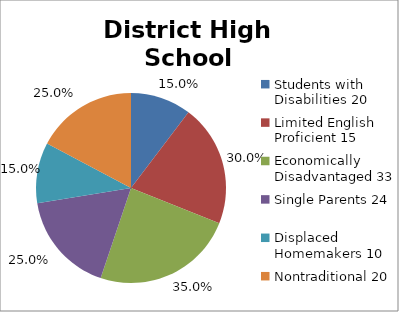
| Category | Series 0 |
|---|---|
| 0 | 0.15 |
| 1 | 0.3 |
| 2 | 0.35 |
| 3 | 0.25 |
| 4 | 0.15 |
| 5 | 0.25 |